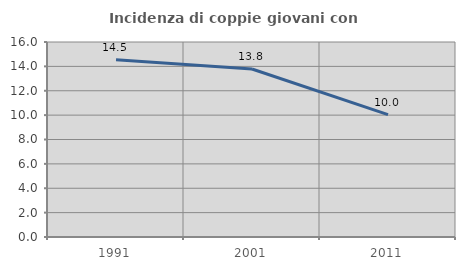
| Category | Incidenza di coppie giovani con figli |
|---|---|
| 1991.0 | 14.538 |
| 2001.0 | 13.787 |
| 2011.0 | 10.039 |